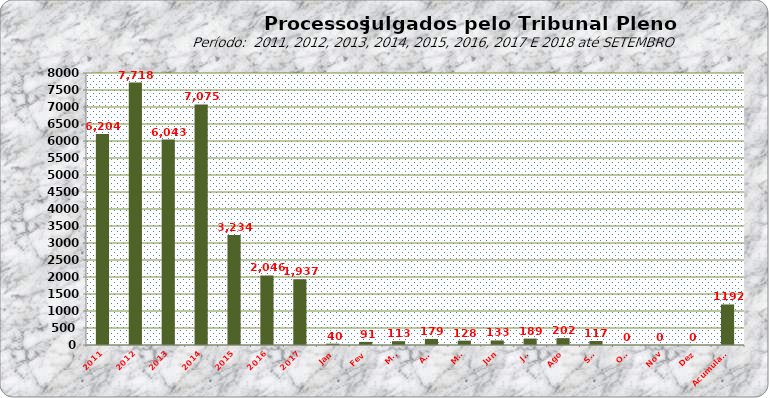
| Category | Series 0 |
|---|---|
| 2011 | 6204 |
| 2012 | 7718 |
| 2013 | 6043 |
| 2014 | 7075 |
| 2015 | 3234 |
| 2016 | 2046 |
| 2017 | 1937 |
| Jan | 40 |
| Fev | 91 |
| Mar | 113 |
| Abr | 179 |
| Mai | 128 |
| Jun | 133 |
| Jul | 189 |
| Ago | 202 |
| Set | 117 |
| Out | 0 |
| Nov | 0 |
| Dez | 0 |
| Acumulado | 1192 |